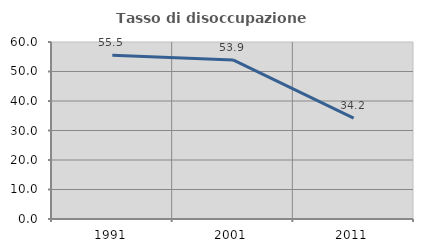
| Category | Tasso di disoccupazione giovanile  |
|---|---|
| 1991.0 | 55.469 |
| 2001.0 | 53.906 |
| 2011.0 | 34.228 |